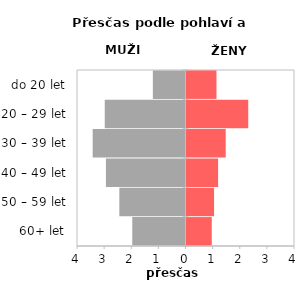
| Category | Přesčas |
|---|---|
| 60+ let | 0.931 |
| 50 – 59 let | 1.016 |
| 40 – 49 let | 1.166 |
| 30 – 39 let | 1.445 |
| 20 – 29 let | 2.276 |
| do 20 let | 1.105 |